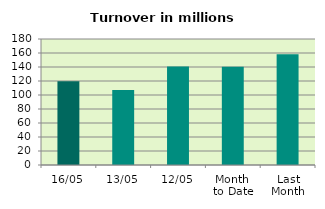
| Category | Series 0 |
|---|---|
| 16/05 | 119.695 |
| 13/05 | 107.316 |
| 12/05 | 140.689 |
| Month 
to Date | 140.419 |
| Last
Month | 158.303 |